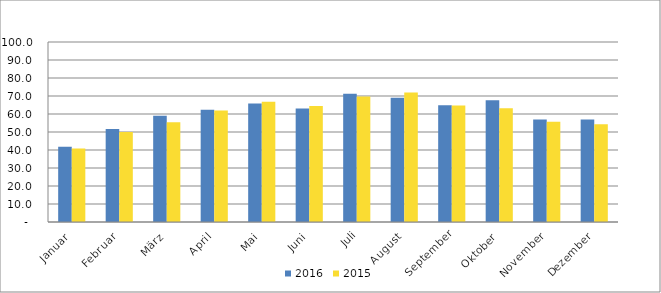
| Category | 2016 | 2015 |
|---|---|---|
| Januar | 41.837 | 40.805 |
| Februar | 51.658 | 50.024 |
| März | 59.023 | 55.349 |
| April | 62.313 | 61.944 |
| Mai | 65.782 | 66.76 |
| Juni | 63.046 | 64.386 |
| Juli | 71.247 | 69.731 |
| August | 69.034 | 71.964 |
| September | 64.835 | 64.776 |
| Oktober | 67.698 | 63.221 |
| November | 56.918 | 55.632 |
| Dezember | 56.936 | 54.276 |